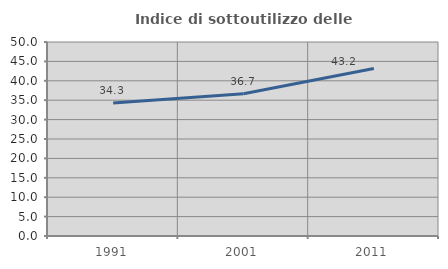
| Category | Indice di sottoutilizzo delle abitazioni  |
|---|---|
| 1991.0 | 34.256 |
| 2001.0 | 36.652 |
| 2011.0 | 43.161 |